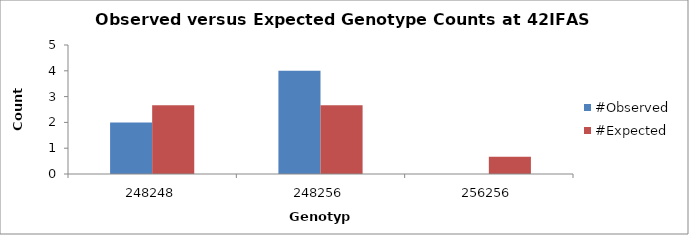
| Category | #Observed | #Expected |
|---|---|---|
| 248248.0 | 2 | 2.667 |
| 248256.0 | 4 | 2.667 |
| 256256.0 | 0 | 0.667 |